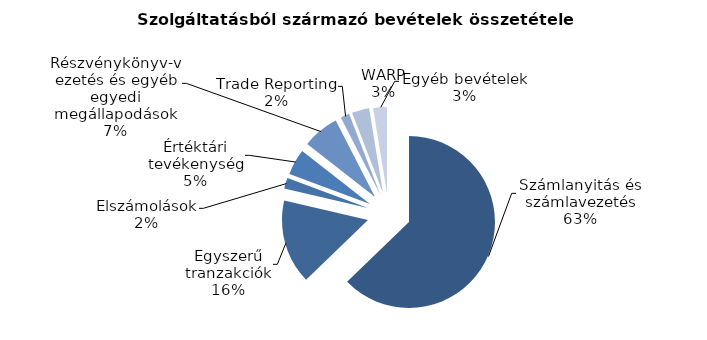
| Category | Series 0 |
|---|---|
| Számlanyitás és számlavezetés | 2677.5 |
| Egyszerű tranzakciók | 675 |
| Elszámolások | 87.6 |
| Értéktári tevékenység | 207.8 |
| Részvénykönyv-vezetés és egyéb egyedi megállapodások | 294.6 |
| Trade Reporting | 71.8 |
| WARP | 139.1 |
| Egyéb bevételek | 110.6 |